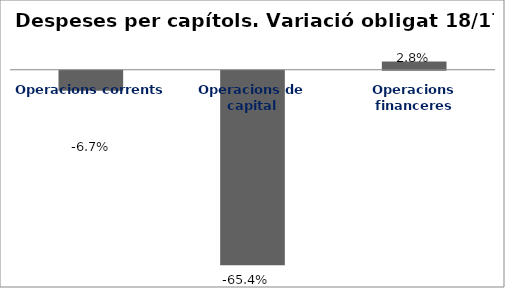
| Category | Series 0 |
|---|---|
| Operacions corrents | -0.067 |
| Operacions de capital | -0.654 |
| Operacions financeres | 0.028 |